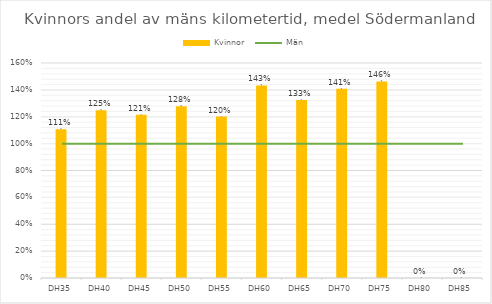
| Category | Kvinnor |
|---|---|
| DH35 | 1.107 |
| DH40 | 1.248 |
| DH45 | 1.215 |
| DH50 | 1.278 |
| DH55 | 1.201 |
| DH60 | 1.433 |
| DH65 | 1.326 |
| DH70 | 1.408 |
| DH75 | 1.463 |
| DH80 | 0 |
| DH85 | 0 |